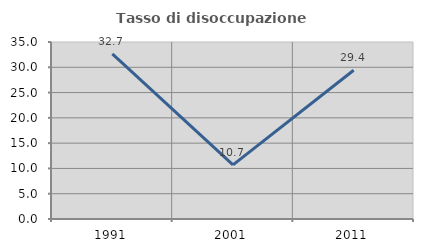
| Category | Tasso di disoccupazione giovanile  |
|---|---|
| 1991.0 | 32.653 |
| 2001.0 | 10.714 |
| 2011.0 | 29.412 |